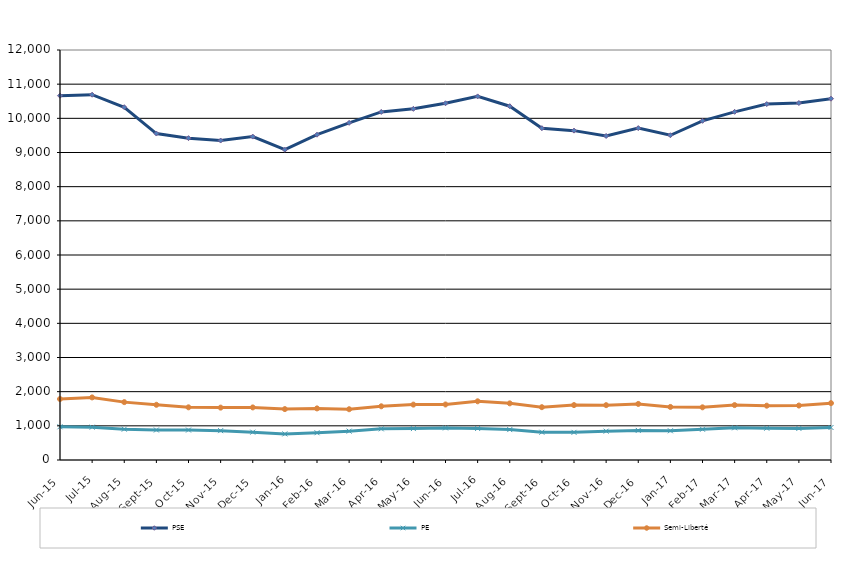
| Category | PSE | PE | Semi-Liberté |
|---|---|---|---|
| 2015-06-01 | 10662 | 973 | 1785 |
| 2015-07-01 | 10692 | 961 | 1832 |
| 2015-08-01 | 10325 | 903 | 1694 |
| 2015-09-01 | 9555 | 878 | 1616 |
| 2015-10-01 | 9420 | 877 | 1542 |
| 2015-11-01 | 9350 | 859 | 1533 |
| 2015-12-01 | 9466 | 815 | 1539 |
| 2016-01-01 | 9081 | 764 | 1490 |
| 2016-02-01 | 9521 | 798 | 1510 |
| 2016-03-01 | 9868 | 845 | 1486 |
| 2016-04-01 | 10187 | 912 | 1572 |
| 2016-05-01 | 10278 | 920 | 1621 |
| 2016-06-01 | 10441 | 939 | 1625 |
| 2016-07-01 | 10642 | 923 | 1718 |
| 2016-08-01 | 10355 | 890 | 1658 |
| 2016-09-01 | 9712 | 813 | 1546 |
| 2016-10-01 | 9640 | 809 | 1607 |
| 2016-11-01 | 9484 | 844 | 1605 |
| 2016-12-01 | 9714 | 866 | 1641 |
| 2017-01-01 | 9505 | 855 | 1553 |
| 2017-02-01 | 9927 | 900 | 1542 |
| 2017-03-01 | 10190 | 942 | 1607 |
| 2017-04-01 | 10417 | 931 | 1590 |
| 2017-05-01 | 10448 | 924 | 1594 |
| 2017-06-01 | 10575 | 951 | 1664 |